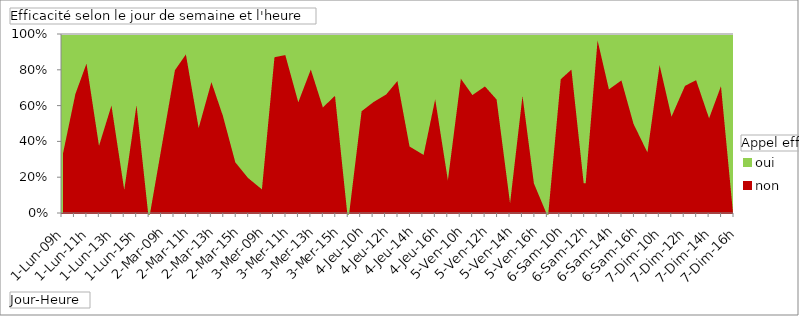
| Category | non | oui |
|---|---|---|
| 1-Lun-09h | 0.333 | 0.667 |
| 1-Lun-10h | 0.667 | 0.333 |
| 1-Lun-11h | 0.857 | 0.143 |
| 1-Lun-12h | 0.4 | 0.6 |
| 1-Lun-13h | 0.625 | 0.375 |
| 1-Lun-14h | 0.167 | 0.833 |
| 1-Lun-15h | 0.647 | 0.353 |
| 1-Lun-16h | 0 | 1 |
| 2-Mar-09h | 0.4 | 0.6 |
| 2-Mar-10h | 0.8 | 0.2 |
| 2-Mar-11h | 0.9 | 0.1 |
| 2-Mar-12h | 0.5 | 0.5 |
| 2-Mar-13h | 0.75 | 0.25 |
| 2-Mar-14h | 0.545 | 0.455 |
| 2-Mar-15h | 0.286 | 0.714 |
| 2-Mar-16h | 0.2 | 0.8 |
| 3-Mer-09h | 0.143 | 0.857 |
| 3-Mer-10h | 0.875 | 0.125 |
| 3-Mer-11h | 0.889 | 0.111 |
| 3-Mer-12h | 0.636 | 0.364 |
| 3-Mer-13h | 0.818 | 0.182 |
| 3-Mer-14h | 0.6 | 0.4 |
| 3-Mer-15h | 0.667 | 0.333 |
| 4-Jeu-09h | 0 | 1 |
| 4-Jeu-10h | 0.571 | 0.429 |
| 4-Jeu-11h | 0.625 | 0.375 |
| 4-Jeu-12h | 0.667 | 0.333 |
| 4-Jeu-13h | 0.75 | 0.25 |
| 4-Jeu-14h | 0.375 | 0.625 |
| 4-Jeu-15h | 0.333 | 0.667 |
| 4-Jeu-16h | 0.667 | 0.333 |
| 5-Ven-09h | 0.222 | 0.778 |
| 5-Ven-10h | 0.765 | 0.235 |
| 5-Ven-11h | 0.667 | 0.333 |
| 5-Ven-12h | 0.714 | 0.286 |
| 5-Ven-13h | 0.636 | 0.364 |
| 5-Ven-14h | 0.1 | 0.9 |
| 5-Ven-15h | 0.7 | 0.3 |
| 5-Ven-16h | 0.167 | 0.833 |
| 6-Sam-09h | 0 | 1 |
| 6-Sam-10h | 0.75 | 0.25 |
| 6-Sam-11h | 0.812 | 0.188 |
| 6-Sam-12h | 0.167 | 0.833 |
| 6-Sam-13h | 1 | 0 |
| 6-Sam-14h | 0.7 | 0.3 |
| 6-Sam-15h | 0.75 | 0.25 |
| 6-Sam-16h | 0.5 | 0.5 |
| 7-Dim-09h | 0.357 | 0.643 |
| 7-Dim-10h | 0.857 | 0.143 |
| 7-Dim-11h | 0.556 | 0.444 |
| 7-Dim-12h | 0.714 | 0.286 |
| 7-Dim-13h | 0.75 | 0.25 |
| 7-Dim-14h | 0.545 | 0.455 |
| 7-Dim-15h | 0.733 | 0.267 |
| 7-Dim-16h | 0 | 1 |